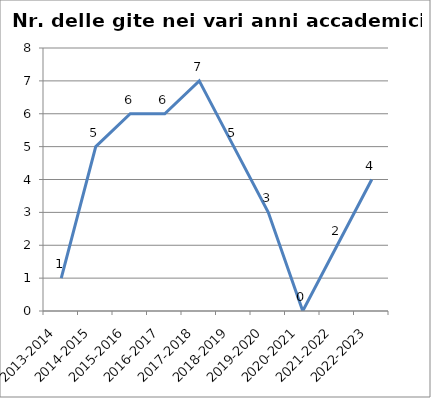
| Category | Nr. Gite Svolte |
|---|---|
| 2013-2014 | 1 |
| 2014-2015 | 5 |
| 2015-2016 | 6 |
| 2016-2017 | 6 |
| 2017-2018 | 7 |
| 2018-2019 | 5 |
| 2019-2020 | 3 |
| 2020-2021 | 0 |
| 2021-2022 | 2 |
| 2022-2023 | 4 |